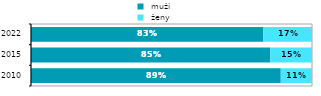
| Category |  muži |  ženy |
|---|---|---|
| 2010.0 | 0.889 | 0.111 |
| 2015.0 | 0.852 | 0.148 |
| 2022.0 | 0.827 | 0.173 |